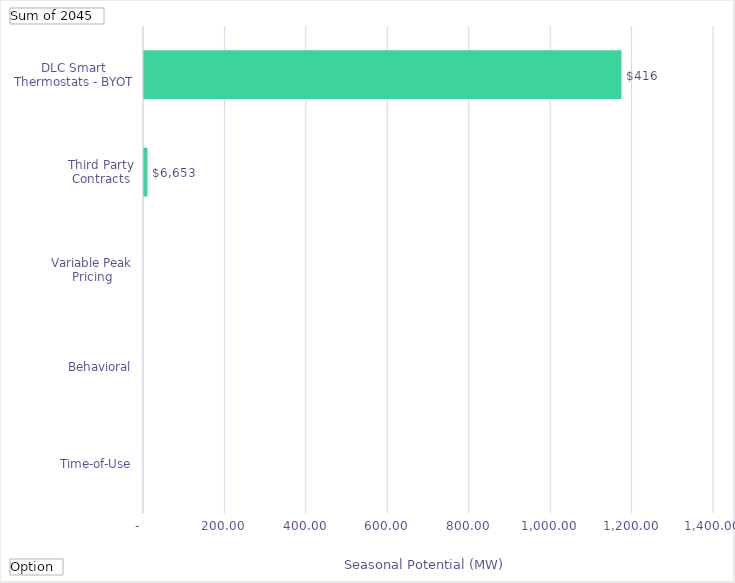
| Category | Winter Peak Reduction @Meter  (Therms) |
|---|---|
| Time-of-Use | 0 |
| Behavioral | 0 |
| Variable Peak Pricing | 0 |
| Third Party Contracts | 8.557 |
| DLC Smart Thermostats - BYOT | 1172.801 |